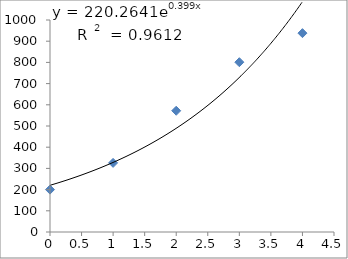
| Category | Series 0 |
|---|---|
| 0.0 | 200 |
| 1.0 | 326 |
| 2.0 | 572 |
| 3.0 | 801 |
| 4.0 | 938 |